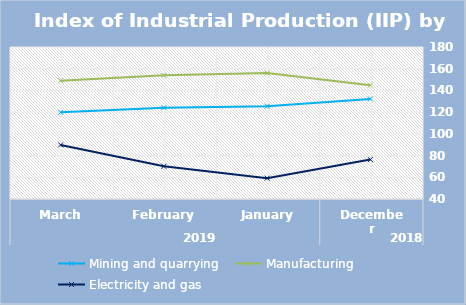
| Category | Mining and quarrying   | Manufacturing | Electricity and gas |
|---|---|---|---|
| 0 | 132.18 | 144.85 | 76.31 |
| 1 | 125.45 | 155.98 | 59.15 |
| 2 | 124.14 | 153.87 | 70.1 |
| 3 | 119.87 | 148.98 | 89.82 |